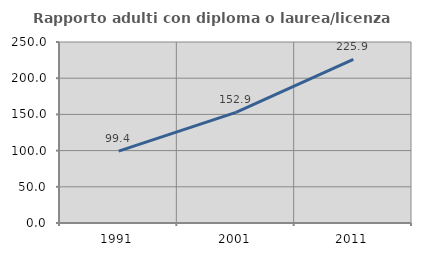
| Category | Rapporto adulti con diploma o laurea/licenza media  |
|---|---|
| 1991.0 | 99.374 |
| 2001.0 | 152.861 |
| 2011.0 | 225.88 |